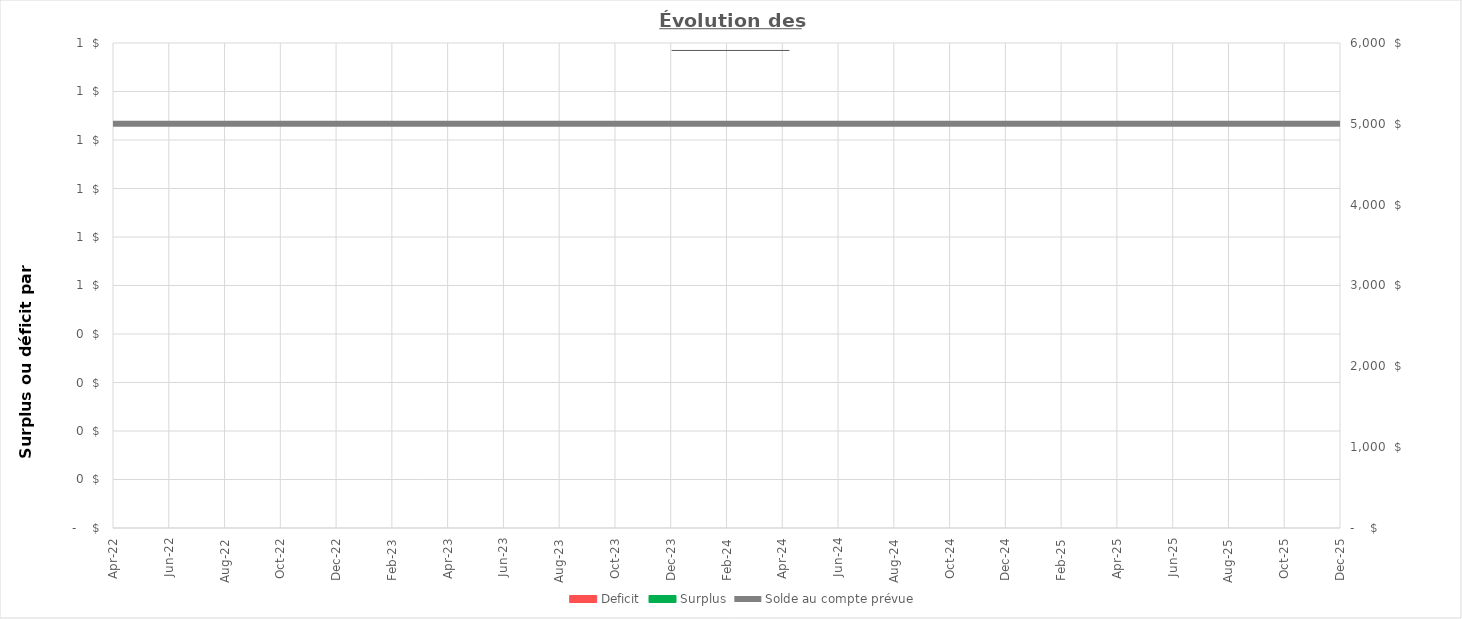
| Category | Deficit | Surplus |
|---|---|---|
| avr-22 | 0 | 0 |
| mai-22 | 0 | 0 |
| juin-22 | 0 | 0 |
| juil-22 | 0 | 0 |
| août-22 | 0 | 0 |
| sept-22 | 0 | 0 |
| oct-22 | 0 | 0 |
| nov-22 | 0 | 0 |
| déc-22 | 0 | 0 |
| janv-23 | 0 | 0 |
| févr-23 | 0 | 0 |
| mars-23 | 0 | 0 |
| avr-23 | 0 | 0 |
| mai-23 | 0 | 0 |
| juin-23 | 0 | 0 |
| juil-23 | 0 | 0 |
| août-23 | 0 | 0 |
| sept-23 | 0 | 0 |
| oct-23 | 0 | 0 |
| nov-23 | 0 | 0 |
| déc-23 | 0 | 0 |
| janv-24 | 0 | 0 |
| févr-24 | 0 | 0 |
| mars-24 | 0 | 0 |
| avr-24 | 0 | 0 |
| mai-24 | 0 | 0 |
| juin-24 | 0 | 0 |
| juil-24 | 0 | 0 |
| août-24 | 0 | 0 |
| sept-24 | 0 | 0 |
| oct-24 | 0 | 0 |
| nov-24 | 0 | 0 |
| déc-24 | 0 | 0 |
| janv-25 | 0 | 0 |
| févr-25 | 0 | 0 |
| mars-25 | 0 | 0 |
| avr-25 | 0 | 0 |
| mai-25 | 0 | 0 |
| juin-25 | 0 | 0 |
| juil-25 | 0 | 0 |
| août-25 | 0 | 0 |
| sept-25 | 0 | 0 |
| oct-25 | 0 | 0 |
| nov-25 | 0 | 0 |
| déc-25 | 0 | 0 |